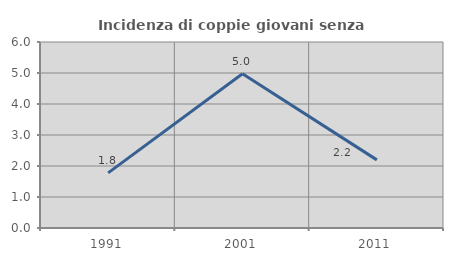
| Category | Incidenza di coppie giovani senza figli |
|---|---|
| 1991.0 | 1.778 |
| 2001.0 | 4.977 |
| 2011.0 | 2.198 |